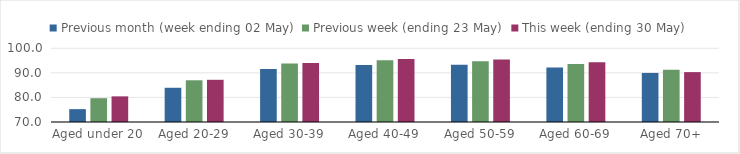
| Category | Previous month (week ending 02 May) | Previous week (ending 23 May) | This week (ending 30 May) |
|---|---|---|---|
| Aged under 20 | 75.232 | 79.682 | 80.433 |
| Aged 20-29 | 83.93 | 86.985 | 87.174 |
| Aged 30-39 | 91.565 | 93.813 | 94.04 |
| Aged 40-49 | 93.165 | 95.152 | 95.654 |
| Aged 50-59 | 93.337 | 94.686 | 95.462 |
| Aged 60-69 | 92.153 | 93.578 | 94.323 |
| Aged 70+ | 89.972 | 91.258 | 90.302 |